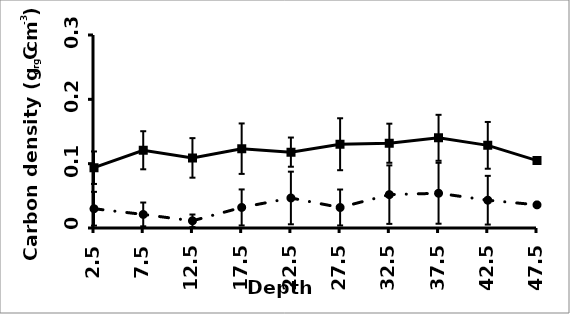
| Category | vegetated | unvegetated |
|---|---|---|
| 2.5 | 0.094 | 0.03 |
| 7.5 | 0.121 | 0.021 |
| 12.5 | 0.109 | 0.011 |
| 17.5 | 0.123 | 0.032 |
| 22.5 | 0.118 | 0.047 |
| 27.5 | 0.13 | 0.032 |
| 32.5 | 0.132 | 0.052 |
| 37.5 | 0.14 | 0.054 |
| 42.5 | 0.128 | 0.043 |
| 47.5 | 0.105 | 0.036 |